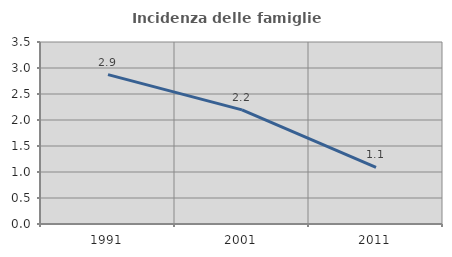
| Category | Incidenza delle famiglie numerose |
|---|---|
| 1991.0 | 2.873 |
| 2001.0 | 2.194 |
| 2011.0 | 1.087 |